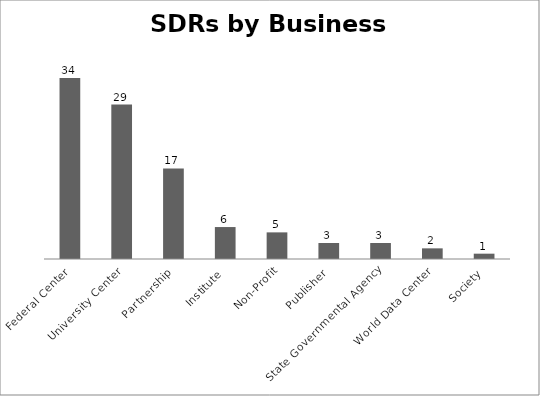
| Category | Series 0 |
|---|---|
| Federal Center | 34 |
| University Center | 29 |
| Partnership | 17 |
| Institute | 6 |
| Non-Profit | 5 |
| Publisher | 3 |
| State Governmental Agency | 3 |
| World Data Center | 2 |
| Society | 1 |